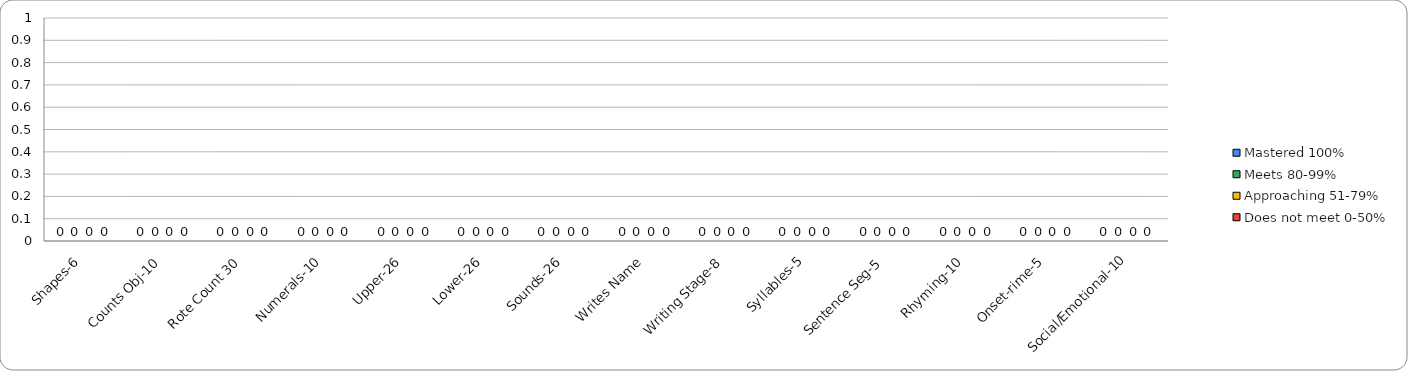
| Category | Mastered 100% | Meets 80-99% | Approaching 51-79% | Does not meet 0-50% |
|---|---|---|---|---|
| Shapes-6 | 0 | 0 | 0 | 0 |
| Counts Obj-10 | 0 | 0 | 0 | 0 |
| Rote Count 30 | 0 | 0 | 0 | 0 |
| Numerals-10 | 0 | 0 | 0 | 0 |
| Upper-26 | 0 | 0 | 0 | 0 |
| Lower-26 | 0 | 0 | 0 | 0 |
| Sounds-26 | 0 | 0 | 0 | 0 |
| Writes Name | 0 | 0 | 0 | 0 |
| Writing Stage-8 | 0 | 0 | 0 | 0 |
| Syllables-5 | 0 | 0 | 0 | 0 |
| Sentence Seg-5 | 0 | 0 | 0 | 0 |
| Rhyming-10 | 0 | 0 | 0 | 0 |
| Onset-rime-5 | 0 | 0 | 0 | 0 |
| Social/Emotional-10 | 0 | 0 | 0 | 0 |